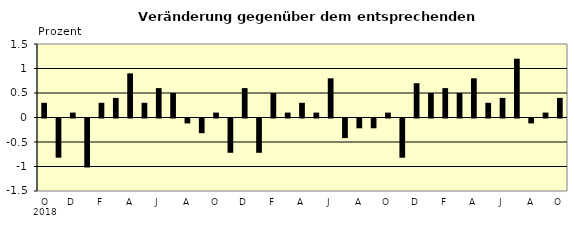
| Category | Series 0 |
|---|---|
| 0 | 0.3 |
| 1 | -0.8 |
| 2 | 0.1 |
| 3 | -1 |
| 4 | 0.3 |
| 5 | 0.4 |
| 6 | 0.9 |
| 7 | 0.3 |
| 8 | 0.6 |
| 9 | 0.5 |
| 10 | -0.1 |
| 11 | -0.3 |
| 12 | 0.1 |
| 13 | -0.7 |
| 14 | 0.6 |
| 15 | -0.7 |
| 16 | 0.5 |
| 17 | 0.1 |
| 18 | 0.3 |
| 19 | 0.1 |
| 20 | 0.8 |
| 21 | -0.4 |
| 22 | -0.2 |
| 23 | -0.2 |
| 24 | 0.1 |
| 25 | -0.8 |
| 26 | 0.7 |
| 27 | 0.5 |
| 28 | 0.6 |
| 29 | 0.5 |
| 30 | 0.8 |
| 31 | 0.3 |
| 32 | 0.4 |
| 33 | 1.2 |
| 34 | -0.1 |
| 35 | 0.1 |
| 36 | 0.4 |